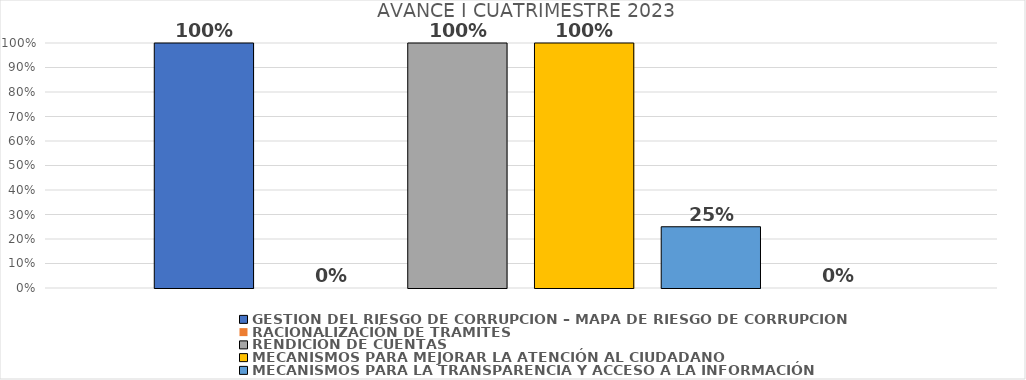
| Category | GESTIÓN DEL RIESGO DE CORRUPCIÓN – MAPA DE RIESGO DE CORRUPCIÓN  | RACIONALIZACIÓN DE TRAMITES | RENDICIÓN DE CUENTAS | MECANISMOS PARA MEJORAR LA ATENCIÓN AL CIUDADANO | MECANISMOS PARA LA TRANSPARENCIA Y ACCESO A LA INFORMACIÓN | INICIATIVAS ADICIONALES |
|---|---|---|---|---|---|---|
| 0 | 1 | 0 | 1 | 1 | 0.25 | 0 |